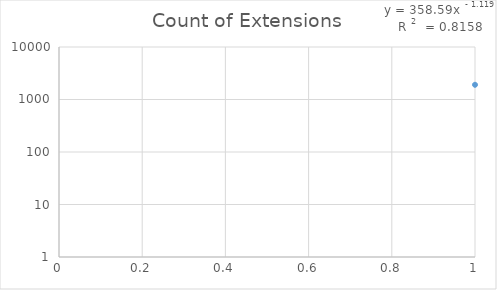
| Category | Count of Extensions |
|---|---|
| 0 | 1907 |
| 1 | 830 |
| 2 | 307 |
| 3 | 290 |
| 4 | 288 |
| 5 | 211 |
| 6 | 180 |
| 7 | 180 |
| 8 | 129 |
| 9 | 122 |
| 10 | 57 |
| 11 | 53 |
| 12 | 33 |
| 13 | 22 |
| 14 | 22 |
| 15 | 21 |
| 16 | 18 |
| 17 | 17 |
| 18 | 17 |
| 19 | 16 |
| 20 | 14 |
| 21 | 14 |
| 22 | 13 |
| 23 | 12 |
| 24 | 12 |
| 25 | 11 |
| 26 | 10 |
| 27 | 9 |
| 28 | 8 |
| 29 | 8 |
| 30 | 7 |
| 31 | 7 |
| 32 | 6 |
| 33 | 6 |
| 34 | 6 |
| 35 | 5 |
| 36 | 5 |
| 37 | 5 |
| 38 | 5 |
| 39 | 5 |
| 40 | 4 |
| 41 | 4 |
| 42 | 4 |
| 43 | 4 |
| 44 | 4 |
| 45 | 4 |
| 46 | 4 |
| 47 | 4 |
| 48 | 4 |
| 49 | 4 |
| 50 | 3 |
| 51 | 3 |
| 52 | 3 |
| 53 | 3 |
| 54 | 3 |
| 55 | 3 |
| 56 | 3 |
| 57 | 3 |
| 58 | 3 |
| 59 | 3 |
| 60 | 3 |
| 61 | 2 |
| 62 | 2 |
| 63 | 2 |
| 64 | 2 |
| 65 | 2 |
| 66 | 2 |
| 67 | 2 |
| 68 | 2 |
| 69 | 2 |
| 70 | 1 |
| 71 | 1 |
| 72 | 1 |
| 73 | 1 |
| 74 | 1 |
| 75 | 1 |
| 76 | 1 |
| 77 | 1 |
| 78 | 1 |
| 79 | 1 |
| 80 | 1 |
| 81 | 1 |
| 82 | 1 |
| 83 | 1 |
| 84 | 1 |
| 85 | 1 |
| 86 | 1 |
| 87 | 1 |
| 88 | 1 |
| 89 | 1 |
| 90 | 1 |
| 91 | 1 |
| 92 | 1 |
| 93 | 1 |
| 94 | 1 |
| 95 | 1 |
| 96 | 1 |
| 97 | 1 |
| 98 | 1 |
| 99 | 1 |
| 100 | 1 |
| 101 | 1 |
| 102 | 1 |
| 103 | 1 |
| 104 | 1 |
| 105 | 1 |
| 106 | 1 |
| 107 | 1 |
| 108 | 1 |
| 109 | 1 |
| 110 | 1 |
| 111 | 1 |
| 112 | 1 |
| 113 | 1 |
| 114 | 1 |
| 115 | 1 |
| 116 | 1 |
| 117 | 1 |
| 118 | 1 |
| 119 | 1 |
| 120 | 1 |
| 121 | 1 |
| 122 | 1 |
| 123 | 1 |
| 124 | 1 |
| 125 | 1 |
| 126 | 1 |
| 127 | 1 |
| 128 | 1 |
| 129 | 1 |
| 130 | 1 |
| 131 | 1 |
| 132 | 1 |
| 133 | 1 |
| 134 | 1 |
| 135 | 1 |
| 136 | 1 |
| 137 | 1 |
| 138 | 1 |
| 139 | 1 |
| 140 | 1 |
| 141 | 1 |
| 142 | 1 |
| 143 | 1 |
| 144 | 1 |
| 145 | 1 |
| 146 | 1 |
| 147 | 1 |
| 148 | 1 |
| 149 | 1 |
| 150 | 1 |
| 151 | 1 |
| 152 | 1 |
| 153 | 1 |
| 154 | 1 |
| 155 | 1 |
| 156 | 1 |
| 157 | 1 |
| 158 | 1 |
| 159 | 1 |
| 160 | 1 |
| 161 | 1 |
| 162 | 1 |
| 163 | 1 |
| 164 | 1 |
| 165 | 1 |
| 166 | 1 |
| 167 | 1 |
| 168 | 1 |
| 169 | 1 |
| 170 | 1 |
| 171 | 1 |
| 172 | 1 |
| 173 | 1 |
| 174 | 1 |
| 175 | 1 |
| 176 | 1 |
| 177 | 1 |
| 178 | 1 |
| 179 | 1 |
| 180 | 1 |
| 181 | 1 |
| 182 | 1 |
| 183 | 1 |
| 184 | 1 |
| 185 | 1 |
| 186 | 1 |
| 187 | 1 |
| 188 | 1 |
| 189 | 1 |
| 190 | 1 |
| 191 | 1 |
| 192 | 1 |
| 193 | 1 |
| 194 | 1 |
| 195 | 1 |
| 196 | 1 |
| 197 | 1 |
| 198 | 1 |
| 199 | 1 |
| 200 | 1 |
| 201 | 1 |
| 202 | 1 |
| 203 | 1 |
| 204 | 1 |
| 205 | 1 |
| 206 | 1 |
| 207 | 1 |
| 208 | 1 |
| 209 | 1 |
| 210 | 1 |
| 211 | 1 |
| 212 | 1 |
| 213 | 1 |
| 214 | 1 |
| 215 | 1 |
| 216 | 1 |
| 217 | 1 |
| 218 | 1 |
| 219 | 1 |
| 220 | 1 |
| 221 | 1 |
| 222 | 1 |
| 223 | 1 |
| 224 | 1 |
| 225 | 1 |
| 226 | 1 |
| 227 | 1 |
| 228 | 1 |
| 229 | 1 |
| 230 | 1 |
| 231 | 1 |
| 232 | 1 |
| 233 | 1 |
| 234 | 1 |
| 235 | 1 |
| 236 | 1 |
| 237 | 1 |
| 238 | 1 |
| 239 | 1 |
| 240 | 1 |
| 241 | 1 |
| 242 | 1 |
| 243 | 1 |
| 244 | 1 |
| 245 | 1 |
| 246 | 1 |
| 247 | 1 |
| 248 | 1 |
| 249 | 1 |
| 250 | 1 |
| 251 | 1 |
| 252 | 1 |
| 253 | 1 |
| 254 | 1 |
| 255 | 1 |
| 256 | 1 |
| 257 | 1 |
| 258 | 1 |
| 259 | 1 |
| 260 | 1 |
| 261 | 1 |
| 262 | 1 |
| 263 | 1 |
| 264 | 1 |
| 265 | 1 |
| 266 | 1 |
| 267 | 1 |
| 268 | 1 |
| 269 | 1 |
| 270 | 1 |
| 271 | 1 |
| 272 | 1 |
| 273 | 1 |
| 274 | 1 |
| 275 | 1 |
| 276 | 1 |
| 277 | 1 |
| 278 | 1 |
| 279 | 1 |
| 280 | 1 |
| 281 | 1 |
| 282 | 1 |
| 283 | 1 |
| 284 | 1 |
| 285 | 1 |
| 286 | 1 |
| 287 | 1 |
| 288 | 1 |
| 289 | 1 |
| 290 | 1 |
| 291 | 1 |
| 292 | 1 |
| 293 | 1 |
| 294 | 1 |
| 295 | 1 |
| 296 | 1 |
| 297 | 1 |
| 298 | 1 |
| 299 | 1 |
| 300 | 1 |
| 301 | 1 |
| 302 | 1 |
| 303 | 1 |
| 304 | 1 |
| 305 | 1 |
| 306 | 1 |
| 307 | 1 |
| 308 | 1 |
| 309 | 1 |
| 310 | 1 |
| 311 | 1 |
| 312 | 1 |
| 313 | 1 |
| 314 | 1 |
| 315 | 1 |
| 316 | 1 |
| 317 | 1 |
| 318 | 1 |
| 319 | 1 |
| 320 | 1 |
| 321 | 1 |
| 322 | 1 |
| 323 | 1 |
| 324 | 1 |
| 325 | 1 |
| 326 | 1 |
| 327 | 1 |
| 328 | 1 |
| 329 | 1 |
| 330 | 1 |
| 331 | 1 |
| 332 | 1 |
| 333 | 1 |